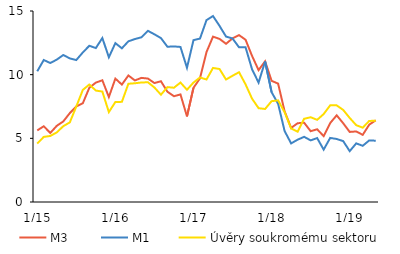
| Category | M3  | M1 | Úvěry soukromému sektoru |
|---|---|---|---|
|  1/15 | 5.622 | 10.265 | 4.593 |
| 2 | 5.948 | 11.151 | 5.114 |
| 3 | 5.423 | 10.914 | 5.186 |
| 4 | 5.983 | 11.181 | 5.467 |
| 5 | 6.33 | 11.545 | 5.955 |
| 6 | 6.98 | 11.278 | 6.253 |
| 7 | 7.5 | 11.149 | 7.503 |
| 8 | 7.755 | 11.745 | 8.802 |
| 9 | 8.971 | 12.27 | 9.227 |
| 10 | 9.377 | 12.089 | 8.753 |
| 11 | 9.559 | 12.878 | 8.672 |
| 12 | 8.244 | 11.367 | 7.06 |
|  1/16 | 9.691 | 12.477 | 7.853 |
| 2 | 9.221 | 12.071 | 7.865 |
| 3 | 9.937 | 12.619 | 9.286 |
| 4 | 9.548 | 12.796 | 9.325 |
| 5 | 9.747 | 12.937 | 9.385 |
| 6 | 9.696 | 13.442 | 9.403 |
| 7 | 9.341 | 13.169 | 8.992 |
| 8 | 9.484 | 12.872 | 8.426 |
| 9 | 8.659 | 12.193 | 9.022 |
| 10 | 8.307 | 12.218 | 8.975 |
| 11 | 8.449 | 12.177 | 9.38 |
| 12 | 6.723 | 10.54 | 8.816 |
|  1/17 | 8.966 | 12.711 | 9.379 |
| 2 | 9.714 | 12.834 | 9.781 |
| 3 | 11.775 | 14.282 | 9.62 |
| 4 | 12.987 | 14.606 | 10.528 |
| 5 | 12.808 | 13.83 | 10.445 |
| 6 | 12.425 | 12.993 | 9.619 |
| 7 | 12.849 | 12.842 | 9.914 |
| 8 | 13.105 | 12.147 | 10.193 |
| 9 | 12.743 | 12.148 | 9.238 |
| 10 | 11.473 | 10.419 | 8.113 |
| 11 | 10.355 | 9.377 | 7.368 |
| 12 | 11.047 | 11.032 | 7.305 |
|  1/18 | 9.516 | 8.626 | 7.918 |
| 2 | 9.298 | 7.714 | 7.983 |
| 3 | 7.121 | 5.573 | 7.051 |
| 4 | 5.819 | 4.602 | 5.78 |
| 5 | 6.185 | 4.894 | 5.522 |
| 6 | 6.228 | 5.118 | 6.536 |
| 7 | 5.561 | 4.84 | 6.657 |
| 8 | 5.712 | 5.02 | 6.454 |
| 9 | 5.172 | 4.113 | 6.908 |
| 10 | 6.2 | 5.031 | 7.59 |
| 11 | 6.807 | 4.95 | 7.588 |
| 12 | 6.185 | 4.782 | 7.229 |
|  1/19 | 5.503 | 3.994 | 6.6 |
| 2 | 5.54 | 4.604 | 6.035 |
| 3 | 5.275 | 4.413 | 5.835 |
| 4 | 6.075 | 4.839 | 6.369 |
| 5 | 6.413 | 4.813 | 6.374 |